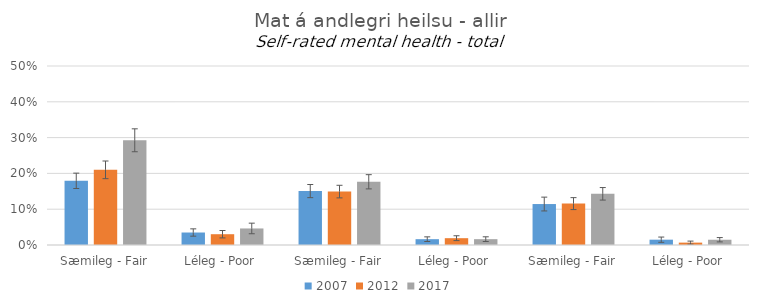
| Category | 2007 | 2012 | 2017 |
|---|---|---|---|
| 0 | 0.179 | 0.21 | 0.293 |
| 1 | 0.035 | 0.03 | 0.046 |
| 2 | 0.151 | 0.149 | 0.177 |
| 3 | 0.016 | 0.019 | 0.016 |
| 4 | 0.114 | 0.116 | 0.143 |
| 5 | 0.015 | 0.007 | 0.015 |